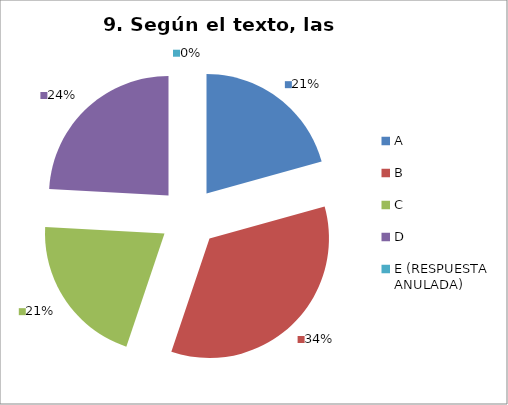
| Category | CANTIDAD DE RESPUESTAS PREGUNTA (9) | PORCENTAJE |
|---|---|---|
| A | 6 | 0.207 |
| B | 10 | 0.345 |
| C | 6 | 0.207 |
| D | 7 | 0.241 |
| E (RESPUESTA ANULADA) | 0 | 0 |